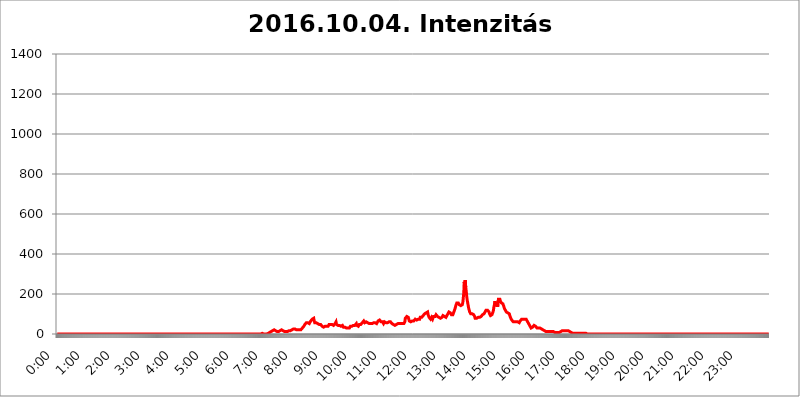
| Category | 2016.10.04. Intenzitás [W/m^2] |
|---|---|
| 0.0 | 0 |
| 0.0006944444444444445 | 0 |
| 0.001388888888888889 | 0 |
| 0.0020833333333333333 | 0 |
| 0.002777777777777778 | 0 |
| 0.003472222222222222 | 0 |
| 0.004166666666666667 | 0 |
| 0.004861111111111111 | 0 |
| 0.005555555555555556 | 0 |
| 0.0062499999999999995 | 0 |
| 0.006944444444444444 | 0 |
| 0.007638888888888889 | 0 |
| 0.008333333333333333 | 0 |
| 0.009027777777777779 | 0 |
| 0.009722222222222222 | 0 |
| 0.010416666666666666 | 0 |
| 0.011111111111111112 | 0 |
| 0.011805555555555555 | 0 |
| 0.012499999999999999 | 0 |
| 0.013194444444444444 | 0 |
| 0.013888888888888888 | 0 |
| 0.014583333333333332 | 0 |
| 0.015277777777777777 | 0 |
| 0.015972222222222224 | 0 |
| 0.016666666666666666 | 0 |
| 0.017361111111111112 | 0 |
| 0.018055555555555557 | 0 |
| 0.01875 | 0 |
| 0.019444444444444445 | 0 |
| 0.02013888888888889 | 0 |
| 0.020833333333333332 | 0 |
| 0.02152777777777778 | 0 |
| 0.022222222222222223 | 0 |
| 0.02291666666666667 | 0 |
| 0.02361111111111111 | 0 |
| 0.024305555555555556 | 0 |
| 0.024999999999999998 | 0 |
| 0.025694444444444447 | 0 |
| 0.02638888888888889 | 0 |
| 0.027083333333333334 | 0 |
| 0.027777777777777776 | 0 |
| 0.02847222222222222 | 0 |
| 0.029166666666666664 | 0 |
| 0.029861111111111113 | 0 |
| 0.030555555555555555 | 0 |
| 0.03125 | 0 |
| 0.03194444444444445 | 0 |
| 0.03263888888888889 | 0 |
| 0.03333333333333333 | 0 |
| 0.034027777777777775 | 0 |
| 0.034722222222222224 | 0 |
| 0.035416666666666666 | 0 |
| 0.036111111111111115 | 0 |
| 0.03680555555555556 | 0 |
| 0.0375 | 0 |
| 0.03819444444444444 | 0 |
| 0.03888888888888889 | 0 |
| 0.03958333333333333 | 0 |
| 0.04027777777777778 | 0 |
| 0.04097222222222222 | 0 |
| 0.041666666666666664 | 0 |
| 0.042361111111111106 | 0 |
| 0.04305555555555556 | 0 |
| 0.043750000000000004 | 0 |
| 0.044444444444444446 | 0 |
| 0.04513888888888889 | 0 |
| 0.04583333333333334 | 0 |
| 0.04652777777777778 | 0 |
| 0.04722222222222222 | 0 |
| 0.04791666666666666 | 0 |
| 0.04861111111111111 | 0 |
| 0.049305555555555554 | 0 |
| 0.049999999999999996 | 0 |
| 0.05069444444444445 | 0 |
| 0.051388888888888894 | 0 |
| 0.052083333333333336 | 0 |
| 0.05277777777777778 | 0 |
| 0.05347222222222222 | 0 |
| 0.05416666666666667 | 0 |
| 0.05486111111111111 | 0 |
| 0.05555555555555555 | 0 |
| 0.05625 | 0 |
| 0.05694444444444444 | 0 |
| 0.057638888888888885 | 0 |
| 0.05833333333333333 | 0 |
| 0.05902777777777778 | 0 |
| 0.059722222222222225 | 0 |
| 0.06041666666666667 | 0 |
| 0.061111111111111116 | 0 |
| 0.06180555555555556 | 0 |
| 0.0625 | 0 |
| 0.06319444444444444 | 0 |
| 0.06388888888888888 | 0 |
| 0.06458333333333334 | 0 |
| 0.06527777777777778 | 0 |
| 0.06597222222222222 | 0 |
| 0.06666666666666667 | 0 |
| 0.06736111111111111 | 0 |
| 0.06805555555555555 | 0 |
| 0.06874999999999999 | 0 |
| 0.06944444444444443 | 0 |
| 0.07013888888888889 | 0 |
| 0.07083333333333333 | 0 |
| 0.07152777777777779 | 0 |
| 0.07222222222222223 | 0 |
| 0.07291666666666667 | 0 |
| 0.07361111111111111 | 0 |
| 0.07430555555555556 | 0 |
| 0.075 | 0 |
| 0.07569444444444444 | 0 |
| 0.0763888888888889 | 0 |
| 0.07708333333333334 | 0 |
| 0.07777777777777778 | 0 |
| 0.07847222222222222 | 0 |
| 0.07916666666666666 | 0 |
| 0.0798611111111111 | 0 |
| 0.08055555555555556 | 0 |
| 0.08125 | 0 |
| 0.08194444444444444 | 0 |
| 0.08263888888888889 | 0 |
| 0.08333333333333333 | 0 |
| 0.08402777777777777 | 0 |
| 0.08472222222222221 | 0 |
| 0.08541666666666665 | 0 |
| 0.08611111111111112 | 0 |
| 0.08680555555555557 | 0 |
| 0.08750000000000001 | 0 |
| 0.08819444444444445 | 0 |
| 0.08888888888888889 | 0 |
| 0.08958333333333333 | 0 |
| 0.09027777777777778 | 0 |
| 0.09097222222222222 | 0 |
| 0.09166666666666667 | 0 |
| 0.09236111111111112 | 0 |
| 0.09305555555555556 | 0 |
| 0.09375 | 0 |
| 0.09444444444444444 | 0 |
| 0.09513888888888888 | 0 |
| 0.09583333333333333 | 0 |
| 0.09652777777777777 | 0 |
| 0.09722222222222222 | 0 |
| 0.09791666666666667 | 0 |
| 0.09861111111111111 | 0 |
| 0.09930555555555555 | 0 |
| 0.09999999999999999 | 0 |
| 0.10069444444444443 | 0 |
| 0.1013888888888889 | 0 |
| 0.10208333333333335 | 0 |
| 0.10277777777777779 | 0 |
| 0.10347222222222223 | 0 |
| 0.10416666666666667 | 0 |
| 0.10486111111111111 | 0 |
| 0.10555555555555556 | 0 |
| 0.10625 | 0 |
| 0.10694444444444444 | 0 |
| 0.1076388888888889 | 0 |
| 0.10833333333333334 | 0 |
| 0.10902777777777778 | 0 |
| 0.10972222222222222 | 0 |
| 0.1111111111111111 | 0 |
| 0.11180555555555556 | 0 |
| 0.11180555555555556 | 0 |
| 0.1125 | 0 |
| 0.11319444444444444 | 0 |
| 0.11388888888888889 | 0 |
| 0.11458333333333333 | 0 |
| 0.11527777777777777 | 0 |
| 0.11597222222222221 | 0 |
| 0.11666666666666665 | 0 |
| 0.1173611111111111 | 0 |
| 0.11805555555555557 | 0 |
| 0.11944444444444445 | 0 |
| 0.12013888888888889 | 0 |
| 0.12083333333333333 | 0 |
| 0.12152777777777778 | 0 |
| 0.12222222222222223 | 0 |
| 0.12291666666666667 | 0 |
| 0.12291666666666667 | 0 |
| 0.12361111111111112 | 0 |
| 0.12430555555555556 | 0 |
| 0.125 | 0 |
| 0.12569444444444444 | 0 |
| 0.12638888888888888 | 0 |
| 0.12708333333333333 | 0 |
| 0.16875 | 0 |
| 0.12847222222222224 | 0 |
| 0.12916666666666668 | 0 |
| 0.12986111111111112 | 0 |
| 0.13055555555555556 | 0 |
| 0.13125 | 0 |
| 0.13194444444444445 | 0 |
| 0.1326388888888889 | 0 |
| 0.13333333333333333 | 0 |
| 0.13402777777777777 | 0 |
| 0.13402777777777777 | 0 |
| 0.13472222222222222 | 0 |
| 0.13541666666666666 | 0 |
| 0.1361111111111111 | 0 |
| 0.13749999999999998 | 0 |
| 0.13819444444444443 | 0 |
| 0.1388888888888889 | 0 |
| 0.13958333333333334 | 0 |
| 0.14027777777777778 | 0 |
| 0.14097222222222222 | 0 |
| 0.14166666666666666 | 0 |
| 0.1423611111111111 | 0 |
| 0.14305555555555557 | 0 |
| 0.14375000000000002 | 0 |
| 0.14444444444444446 | 0 |
| 0.1451388888888889 | 0 |
| 0.1451388888888889 | 0 |
| 0.14652777777777778 | 0 |
| 0.14722222222222223 | 0 |
| 0.14791666666666667 | 0 |
| 0.1486111111111111 | 0 |
| 0.14930555555555555 | 0 |
| 0.15 | 0 |
| 0.15069444444444444 | 0 |
| 0.15138888888888888 | 0 |
| 0.15208333333333332 | 0 |
| 0.15277777777777776 | 0 |
| 0.15347222222222223 | 0 |
| 0.15416666666666667 | 0 |
| 0.15486111111111112 | 0 |
| 0.15555555555555556 | 0 |
| 0.15625 | 0 |
| 0.15694444444444444 | 0 |
| 0.15763888888888888 | 0 |
| 0.15833333333333333 | 0 |
| 0.15902777777777777 | 0 |
| 0.15972222222222224 | 0 |
| 0.16041666666666668 | 0 |
| 0.16111111111111112 | 0 |
| 0.16180555555555556 | 0 |
| 0.1625 | 0 |
| 0.16319444444444445 | 0 |
| 0.1638888888888889 | 0 |
| 0.16458333333333333 | 0 |
| 0.16527777777777777 | 0 |
| 0.16597222222222222 | 0 |
| 0.16666666666666666 | 0 |
| 0.1673611111111111 | 0 |
| 0.16805555555555554 | 0 |
| 0.16874999999999998 | 0 |
| 0.16944444444444443 | 0 |
| 0.17013888888888887 | 0 |
| 0.1708333333333333 | 0 |
| 0.17152777777777775 | 0 |
| 0.17222222222222225 | 0 |
| 0.1729166666666667 | 0 |
| 0.17361111111111113 | 0 |
| 0.17430555555555557 | 0 |
| 0.17500000000000002 | 0 |
| 0.17569444444444446 | 0 |
| 0.1763888888888889 | 0 |
| 0.17708333333333334 | 0 |
| 0.17777777777777778 | 0 |
| 0.17847222222222223 | 0 |
| 0.17916666666666667 | 0 |
| 0.1798611111111111 | 0 |
| 0.18055555555555555 | 0 |
| 0.18125 | 0 |
| 0.18194444444444444 | 0 |
| 0.1826388888888889 | 0 |
| 0.18333333333333335 | 0 |
| 0.1840277777777778 | 0 |
| 0.18472222222222223 | 0 |
| 0.18541666666666667 | 0 |
| 0.18611111111111112 | 0 |
| 0.18680555555555556 | 0 |
| 0.1875 | 0 |
| 0.18819444444444444 | 0 |
| 0.18888888888888888 | 0 |
| 0.18958333333333333 | 0 |
| 0.19027777777777777 | 0 |
| 0.1909722222222222 | 0 |
| 0.19166666666666665 | 0 |
| 0.19236111111111112 | 0 |
| 0.19305555555555554 | 0 |
| 0.19375 | 0 |
| 0.19444444444444445 | 0 |
| 0.1951388888888889 | 0 |
| 0.19583333333333333 | 0 |
| 0.19652777777777777 | 0 |
| 0.19722222222222222 | 0 |
| 0.19791666666666666 | 0 |
| 0.1986111111111111 | 0 |
| 0.19930555555555554 | 0 |
| 0.19999999999999998 | 0 |
| 0.20069444444444443 | 0 |
| 0.20138888888888887 | 0 |
| 0.2020833333333333 | 0 |
| 0.2027777777777778 | 0 |
| 0.2034722222222222 | 0 |
| 0.2041666666666667 | 0 |
| 0.20486111111111113 | 0 |
| 0.20555555555555557 | 0 |
| 0.20625000000000002 | 0 |
| 0.20694444444444446 | 0 |
| 0.2076388888888889 | 0 |
| 0.20833333333333334 | 0 |
| 0.20902777777777778 | 0 |
| 0.20972222222222223 | 0 |
| 0.21041666666666667 | 0 |
| 0.2111111111111111 | 0 |
| 0.21180555555555555 | 0 |
| 0.2125 | 0 |
| 0.21319444444444444 | 0 |
| 0.2138888888888889 | 0 |
| 0.21458333333333335 | 0 |
| 0.2152777777777778 | 0 |
| 0.21597222222222223 | 0 |
| 0.21666666666666667 | 0 |
| 0.21736111111111112 | 0 |
| 0.21805555555555556 | 0 |
| 0.21875 | 0 |
| 0.21944444444444444 | 0 |
| 0.22013888888888888 | 0 |
| 0.22083333333333333 | 0 |
| 0.22152777777777777 | 0 |
| 0.2222222222222222 | 0 |
| 0.22291666666666665 | 0 |
| 0.2236111111111111 | 0 |
| 0.22430555555555556 | 0 |
| 0.225 | 0 |
| 0.22569444444444445 | 0 |
| 0.2263888888888889 | 0 |
| 0.22708333333333333 | 0 |
| 0.22777777777777777 | 0 |
| 0.22847222222222222 | 0 |
| 0.22916666666666666 | 0 |
| 0.2298611111111111 | 0 |
| 0.23055555555555554 | 0 |
| 0.23124999999999998 | 0 |
| 0.23194444444444443 | 0 |
| 0.23263888888888887 | 0 |
| 0.2333333333333333 | 0 |
| 0.2340277777777778 | 0 |
| 0.2347222222222222 | 0 |
| 0.2354166666666667 | 0 |
| 0.23611111111111113 | 0 |
| 0.23680555555555557 | 0 |
| 0.23750000000000002 | 0 |
| 0.23819444444444446 | 0 |
| 0.2388888888888889 | 0 |
| 0.23958333333333334 | 0 |
| 0.24027777777777778 | 0 |
| 0.24097222222222223 | 0 |
| 0.24166666666666667 | 0 |
| 0.2423611111111111 | 0 |
| 0.24305555555555555 | 0 |
| 0.24375 | 0 |
| 0.24444444444444446 | 0 |
| 0.24513888888888888 | 0 |
| 0.24583333333333335 | 0 |
| 0.2465277777777778 | 0 |
| 0.24722222222222223 | 0 |
| 0.24791666666666667 | 0 |
| 0.24861111111111112 | 0 |
| 0.24930555555555556 | 0 |
| 0.25 | 0 |
| 0.25069444444444444 | 0 |
| 0.2513888888888889 | 0 |
| 0.2520833333333333 | 0 |
| 0.25277777777777777 | 0 |
| 0.2534722222222222 | 0 |
| 0.25416666666666665 | 0 |
| 0.2548611111111111 | 0 |
| 0.2555555555555556 | 0 |
| 0.25625000000000003 | 0 |
| 0.2569444444444445 | 0 |
| 0.2576388888888889 | 0 |
| 0.25833333333333336 | 0 |
| 0.2590277777777778 | 0 |
| 0.25972222222222224 | 0 |
| 0.2604166666666667 | 0 |
| 0.2611111111111111 | 0 |
| 0.26180555555555557 | 0 |
| 0.2625 | 0 |
| 0.26319444444444445 | 0 |
| 0.2638888888888889 | 0 |
| 0.26458333333333334 | 0 |
| 0.2652777777777778 | 0 |
| 0.2659722222222222 | 0 |
| 0.26666666666666666 | 0 |
| 0.2673611111111111 | 0 |
| 0.26805555555555555 | 0 |
| 0.26875 | 0 |
| 0.26944444444444443 | 0 |
| 0.2701388888888889 | 0 |
| 0.2708333333333333 | 0 |
| 0.27152777777777776 | 0 |
| 0.2722222222222222 | 0 |
| 0.27291666666666664 | 0 |
| 0.2736111111111111 | 0 |
| 0.2743055555555555 | 0 |
| 0.27499999999999997 | 0 |
| 0.27569444444444446 | 0 |
| 0.27638888888888885 | 0 |
| 0.27708333333333335 | 0 |
| 0.2777777777777778 | 0 |
| 0.27847222222222223 | 0 |
| 0.2791666666666667 | 0 |
| 0.2798611111111111 | 0 |
| 0.28055555555555556 | 0 |
| 0.28125 | 0 |
| 0.28194444444444444 | 0 |
| 0.2826388888888889 | 0 |
| 0.2833333333333333 | 0 |
| 0.28402777777777777 | 0 |
| 0.2847222222222222 | 0 |
| 0.28541666666666665 | 0 |
| 0.28611111111111115 | 0 |
| 0.28680555555555554 | 0 |
| 0.28750000000000003 | 3.525 |
| 0.2881944444444445 | 0 |
| 0.2888888888888889 | 3.525 |
| 0.28958333333333336 | 0 |
| 0.2902777777777778 | 3.525 |
| 0.29097222222222224 | 0 |
| 0.2916666666666667 | 0 |
| 0.2923611111111111 | 0 |
| 0.29305555555555557 | 0 |
| 0.29375 | 0 |
| 0.29444444444444445 | 0 |
| 0.2951388888888889 | 0 |
| 0.29583333333333334 | 3.525 |
| 0.2965277777777778 | 3.525 |
| 0.2972222222222222 | 3.525 |
| 0.29791666666666666 | 7.887 |
| 0.2986111111111111 | 7.887 |
| 0.29930555555555555 | 7.887 |
| 0.3 | 12.257 |
| 0.30069444444444443 | 12.257 |
| 0.3013888888888889 | 12.257 |
| 0.3020833333333333 | 16.636 |
| 0.30277777777777776 | 16.636 |
| 0.3034722222222222 | 21.024 |
| 0.30416666666666664 | 21.024 |
| 0.3048611111111111 | 21.024 |
| 0.3055555555555555 | 16.636 |
| 0.30624999999999997 | 16.636 |
| 0.3069444444444444 | 12.257 |
| 0.3076388888888889 | 12.257 |
| 0.30833333333333335 | 12.257 |
| 0.3090277777777778 | 16.636 |
| 0.30972222222222223 | 16.636 |
| 0.3104166666666667 | 12.257 |
| 0.3111111111111111 | 12.257 |
| 0.31180555555555556 | 12.257 |
| 0.3125 | 16.636 |
| 0.31319444444444444 | 16.636 |
| 0.3138888888888889 | 21.024 |
| 0.3145833333333333 | 21.024 |
| 0.31527777777777777 | 21.024 |
| 0.3159722222222222 | 21.024 |
| 0.31666666666666665 | 16.636 |
| 0.31736111111111115 | 12.257 |
| 0.31805555555555554 | 12.257 |
| 0.31875000000000003 | 12.257 |
| 0.3194444444444445 | 12.257 |
| 0.3201388888888889 | 12.257 |
| 0.32083333333333336 | 12.257 |
| 0.3215277777777778 | 12.257 |
| 0.32222222222222224 | 12.257 |
| 0.3229166666666667 | 12.257 |
| 0.3236111111111111 | 12.257 |
| 0.32430555555555557 | 12.257 |
| 0.325 | 16.636 |
| 0.32569444444444445 | 16.636 |
| 0.3263888888888889 | 21.024 |
| 0.32708333333333334 | 16.636 |
| 0.3277777777777778 | 21.024 |
| 0.3284722222222222 | 21.024 |
| 0.32916666666666666 | 21.024 |
| 0.3298611111111111 | 21.024 |
| 0.33055555555555555 | 25.419 |
| 0.33125 | 25.419 |
| 0.33194444444444443 | 21.024 |
| 0.3326388888888889 | 25.419 |
| 0.3333333333333333 | 25.419 |
| 0.3340277777777778 | 21.024 |
| 0.3347222222222222 | 21.024 |
| 0.3354166666666667 | 21.024 |
| 0.3361111111111111 | 16.636 |
| 0.3368055555555556 | 21.024 |
| 0.33749999999999997 | 21.024 |
| 0.33819444444444446 | 21.024 |
| 0.33888888888888885 | 21.024 |
| 0.33958333333333335 | 21.024 |
| 0.34027777777777773 | 21.024 |
| 0.34097222222222223 | 21.024 |
| 0.3416666666666666 | 21.024 |
| 0.3423611111111111 | 25.419 |
| 0.3430555555555555 | 25.419 |
| 0.34375 | 29.823 |
| 0.3444444444444445 | 29.823 |
| 0.3451388888888889 | 34.234 |
| 0.3458333333333334 | 38.653 |
| 0.34652777777777777 | 38.653 |
| 0.34722222222222227 | 47.511 |
| 0.34791666666666665 | 51.951 |
| 0.34861111111111115 | 51.951 |
| 0.34930555555555554 | 56.398 |
| 0.35000000000000003 | 60.85 |
| 0.3506944444444444 | 51.951 |
| 0.3513888888888889 | 56.398 |
| 0.3520833333333333 | 56.398 |
| 0.3527777777777778 | 56.398 |
| 0.3534722222222222 | 51.951 |
| 0.3541666666666667 | 47.511 |
| 0.3548611111111111 | 51.951 |
| 0.35555555555555557 | 65.31 |
| 0.35625 | 65.31 |
| 0.35694444444444445 | 69.775 |
| 0.3576388888888889 | 74.246 |
| 0.35833333333333334 | 74.246 |
| 0.3590277777777778 | 78.722 |
| 0.3597222222222222 | 78.722 |
| 0.36041666666666666 | 65.31 |
| 0.3611111111111111 | 56.398 |
| 0.36180555555555555 | 56.398 |
| 0.3625 | 56.398 |
| 0.36319444444444443 | 56.398 |
| 0.3638888888888889 | 60.85 |
| 0.3645833333333333 | 56.398 |
| 0.3652777777777778 | 51.951 |
| 0.3659722222222222 | 51.951 |
| 0.3666666666666667 | 47.511 |
| 0.3673611111111111 | 47.511 |
| 0.3680555555555556 | 47.511 |
| 0.36874999999999997 | 47.511 |
| 0.36944444444444446 | 47.511 |
| 0.37013888888888885 | 47.511 |
| 0.37083333333333335 | 43.079 |
| 0.37152777777777773 | 38.653 |
| 0.37222222222222223 | 38.653 |
| 0.3729166666666666 | 34.234 |
| 0.3736111111111111 | 34.234 |
| 0.3743055555555555 | 34.234 |
| 0.375 | 34.234 |
| 0.3756944444444445 | 38.653 |
| 0.3763888888888889 | 43.079 |
| 0.3770833333333334 | 43.079 |
| 0.37777777777777777 | 38.653 |
| 0.37847222222222227 | 38.653 |
| 0.37916666666666665 | 38.653 |
| 0.37986111111111115 | 38.653 |
| 0.38055555555555554 | 38.653 |
| 0.38125000000000003 | 47.511 |
| 0.3819444444444444 | 47.511 |
| 0.3826388888888889 | 51.951 |
| 0.3833333333333333 | 47.511 |
| 0.3840277777777778 | 43.079 |
| 0.3847222222222222 | 47.511 |
| 0.3854166666666667 | 47.511 |
| 0.3861111111111111 | 43.079 |
| 0.38680555555555557 | 43.079 |
| 0.3875 | 43.079 |
| 0.38819444444444445 | 43.079 |
| 0.3888888888888889 | 47.511 |
| 0.38958333333333334 | 51.951 |
| 0.3902777777777778 | 56.398 |
| 0.3909722222222222 | 60.85 |
| 0.39166666666666666 | 47.511 |
| 0.3923611111111111 | 47.511 |
| 0.39305555555555555 | 43.079 |
| 0.39375 | 43.079 |
| 0.39444444444444443 | 38.653 |
| 0.3951388888888889 | 38.653 |
| 0.3958333333333333 | 43.079 |
| 0.3965277777777778 | 43.079 |
| 0.3972222222222222 | 43.079 |
| 0.3979166666666667 | 38.653 |
| 0.3986111111111111 | 43.079 |
| 0.3993055555555556 | 43.079 |
| 0.39999999999999997 | 43.079 |
| 0.40069444444444446 | 38.653 |
| 0.40138888888888885 | 34.234 |
| 0.40208333333333335 | 38.653 |
| 0.40277777777777773 | 38.653 |
| 0.40347222222222223 | 34.234 |
| 0.4041666666666666 | 34.234 |
| 0.4048611111111111 | 29.823 |
| 0.4055555555555555 | 29.823 |
| 0.40625 | 29.823 |
| 0.4069444444444445 | 29.823 |
| 0.4076388888888889 | 29.823 |
| 0.4083333333333334 | 34.234 |
| 0.40902777777777777 | 34.234 |
| 0.40972222222222227 | 29.823 |
| 0.41041666666666665 | 34.234 |
| 0.41111111111111115 | 38.653 |
| 0.41180555555555554 | 34.234 |
| 0.41250000000000003 | 38.653 |
| 0.4131944444444444 | 38.653 |
| 0.4138888888888889 | 38.653 |
| 0.4145833333333333 | 38.653 |
| 0.4152777777777778 | 43.079 |
| 0.4159722222222222 | 43.079 |
| 0.4166666666666667 | 43.079 |
| 0.4173611111111111 | 43.079 |
| 0.41805555555555557 | 47.511 |
| 0.41875 | 47.511 |
| 0.41944444444444445 | 51.951 |
| 0.4201388888888889 | 43.079 |
| 0.42083333333333334 | 43.079 |
| 0.4215277777777778 | 47.511 |
| 0.4222222222222222 | 38.653 |
| 0.42291666666666666 | 43.079 |
| 0.4236111111111111 | 47.511 |
| 0.42430555555555555 | 43.079 |
| 0.425 | 47.511 |
| 0.42569444444444443 | 47.511 |
| 0.4263888888888889 | 51.951 |
| 0.4270833333333333 | 51.951 |
| 0.4277777777777778 | 56.398 |
| 0.4284722222222222 | 56.398 |
| 0.4291666666666667 | 60.85 |
| 0.4298611111111111 | 65.31 |
| 0.4305555555555556 | 60.85 |
| 0.43124999999999997 | 56.398 |
| 0.43194444444444446 | 56.398 |
| 0.43263888888888885 | 60.85 |
| 0.43333333333333335 | 60.85 |
| 0.43402777777777773 | 56.398 |
| 0.43472222222222223 | 56.398 |
| 0.4354166666666666 | 56.398 |
| 0.4361111111111111 | 56.398 |
| 0.4368055555555555 | 56.398 |
| 0.4375 | 51.951 |
| 0.4381944444444445 | 51.951 |
| 0.4388888888888889 | 51.951 |
| 0.4395833333333334 | 51.951 |
| 0.44027777777777777 | 47.511 |
| 0.44097222222222227 | 47.511 |
| 0.44166666666666665 | 51.951 |
| 0.44236111111111115 | 51.951 |
| 0.44305555555555554 | 51.951 |
| 0.44375000000000003 | 56.398 |
| 0.4444444444444444 | 51.951 |
| 0.4451388888888889 | 51.951 |
| 0.4458333333333333 | 56.398 |
| 0.4465277777777778 | 56.398 |
| 0.4472222222222222 | 51.951 |
| 0.4479166666666667 | 51.951 |
| 0.4486111111111111 | 51.951 |
| 0.44930555555555557 | 56.398 |
| 0.45 | 65.31 |
| 0.45069444444444445 | 69.775 |
| 0.4513888888888889 | 69.775 |
| 0.45208333333333334 | 69.775 |
| 0.4527777777777778 | 74.246 |
| 0.4534722222222222 | 74.246 |
| 0.45416666666666666 | 60.85 |
| 0.4548611111111111 | 56.398 |
| 0.45555555555555555 | 60.85 |
| 0.45625 | 60.85 |
| 0.45694444444444443 | 56.398 |
| 0.4576388888888889 | 51.951 |
| 0.4583333333333333 | 56.398 |
| 0.4590277777777778 | 60.85 |
| 0.4597222222222222 | 65.31 |
| 0.4604166666666667 | 60.85 |
| 0.4611111111111111 | 56.398 |
| 0.4618055555555556 | 56.398 |
| 0.46249999999999997 | 56.398 |
| 0.46319444444444446 | 56.398 |
| 0.46388888888888885 | 51.951 |
| 0.46458333333333335 | 56.398 |
| 0.46527777777777773 | 60.85 |
| 0.46597222222222223 | 65.31 |
| 0.4666666666666666 | 65.31 |
| 0.4673611111111111 | 60.85 |
| 0.4680555555555555 | 60.85 |
| 0.46875 | 56.398 |
| 0.4694444444444445 | 51.951 |
| 0.4701388888888889 | 51.951 |
| 0.4708333333333334 | 51.951 |
| 0.47152777777777777 | 47.511 |
| 0.47222222222222227 | 43.079 |
| 0.47291666666666665 | 43.079 |
| 0.47361111111111115 | 43.079 |
| 0.47430555555555554 | 43.079 |
| 0.47500000000000003 | 43.079 |
| 0.4756944444444444 | 47.511 |
| 0.4763888888888889 | 47.511 |
| 0.4770833333333333 | 47.511 |
| 0.4777777777777778 | 51.951 |
| 0.4784722222222222 | 51.951 |
| 0.4791666666666667 | 51.951 |
| 0.4798611111111111 | 51.951 |
| 0.48055555555555557 | 51.951 |
| 0.48125 | 47.511 |
| 0.48194444444444445 | 51.951 |
| 0.4826388888888889 | 51.951 |
| 0.48333333333333334 | 47.511 |
| 0.4840277777777778 | 51.951 |
| 0.4847222222222222 | 51.951 |
| 0.48541666666666666 | 51.951 |
| 0.4861111111111111 | 51.951 |
| 0.48680555555555555 | 56.398 |
| 0.4875 | 60.85 |
| 0.48819444444444443 | 78.722 |
| 0.4888888888888889 | 83.205 |
| 0.4895833333333333 | 83.205 |
| 0.4902777777777778 | 87.692 |
| 0.4909722222222222 | 92.184 |
| 0.4916666666666667 | 92.184 |
| 0.4923611111111111 | 83.205 |
| 0.4930555555555556 | 74.246 |
| 0.49374999999999997 | 65.31 |
| 0.49444444444444446 | 65.31 |
| 0.49513888888888885 | 60.85 |
| 0.49583333333333335 | 60.85 |
| 0.49652777777777773 | 65.31 |
| 0.49722222222222223 | 65.31 |
| 0.4979166666666666 | 65.31 |
| 0.4986111111111111 | 60.85 |
| 0.4993055555555555 | 60.85 |
| 0.5 | 65.31 |
| 0.5006944444444444 | 65.31 |
| 0.5013888888888889 | 65.31 |
| 0.5020833333333333 | 74.246 |
| 0.5027777777777778 | 69.775 |
| 0.5034722222222222 | 69.775 |
| 0.5041666666666667 | 69.775 |
| 0.5048611111111111 | 65.31 |
| 0.5055555555555555 | 74.246 |
| 0.50625 | 74.246 |
| 0.5069444444444444 | 69.775 |
| 0.5076388888888889 | 69.775 |
| 0.5083333333333333 | 74.246 |
| 0.5090277777777777 | 83.205 |
| 0.5097222222222222 | 83.205 |
| 0.5104166666666666 | 83.205 |
| 0.5111111111111112 | 83.205 |
| 0.5118055555555555 | 87.692 |
| 0.5125000000000001 | 87.692 |
| 0.5131944444444444 | 92.184 |
| 0.513888888888889 | 92.184 |
| 0.5145833333333333 | 96.682 |
| 0.5152777777777778 | 101.184 |
| 0.5159722222222222 | 101.184 |
| 0.5166666666666667 | 105.69 |
| 0.517361111111111 | 105.69 |
| 0.5180555555555556 | 105.69 |
| 0.5187499999999999 | 101.184 |
| 0.5194444444444445 | 110.201 |
| 0.5201388888888888 | 96.682 |
| 0.5208333333333334 | 92.184 |
| 0.5215277777777778 | 83.205 |
| 0.5222222222222223 | 78.722 |
| 0.5229166666666667 | 78.722 |
| 0.5236111111111111 | 74.246 |
| 0.5243055555555556 | 78.722 |
| 0.525 | 83.205 |
| 0.5256944444444445 | 78.722 |
| 0.5263888888888889 | 74.246 |
| 0.5270833333333333 | 74.246 |
| 0.5277777777777778 | 87.692 |
| 0.5284722222222222 | 92.184 |
| 0.5291666666666667 | 87.692 |
| 0.5298611111111111 | 87.692 |
| 0.5305555555555556 | 92.184 |
| 0.53125 | 96.682 |
| 0.5319444444444444 | 96.682 |
| 0.5326388888888889 | 92.184 |
| 0.5333333333333333 | 87.692 |
| 0.5340277777777778 | 87.692 |
| 0.5347222222222222 | 83.205 |
| 0.5354166666666667 | 83.205 |
| 0.5361111111111111 | 78.722 |
| 0.5368055555555555 | 78.722 |
| 0.5375 | 78.722 |
| 0.5381944444444444 | 78.722 |
| 0.5388888888888889 | 83.205 |
| 0.5395833333333333 | 83.205 |
| 0.5402777777777777 | 87.692 |
| 0.5409722222222222 | 92.184 |
| 0.5416666666666666 | 92.184 |
| 0.5423611111111112 | 92.184 |
| 0.5430555555555555 | 87.692 |
| 0.5437500000000001 | 83.205 |
| 0.5444444444444444 | 83.205 |
| 0.545138888888889 | 83.205 |
| 0.5458333333333333 | 87.692 |
| 0.5465277777777778 | 92.184 |
| 0.5472222222222222 | 96.682 |
| 0.5479166666666667 | 101.184 |
| 0.548611111111111 | 105.69 |
| 0.5493055555555556 | 110.201 |
| 0.5499999999999999 | 110.201 |
| 0.5506944444444445 | 110.201 |
| 0.5513888888888888 | 105.69 |
| 0.5520833333333334 | 101.184 |
| 0.5527777777777778 | 96.682 |
| 0.5534722222222223 | 92.184 |
| 0.5541666666666667 | 92.184 |
| 0.5548611111111111 | 96.682 |
| 0.5555555555555556 | 101.184 |
| 0.55625 | 110.201 |
| 0.5569444444444445 | 114.716 |
| 0.5576388888888889 | 123.758 |
| 0.5583333333333333 | 132.814 |
| 0.5590277777777778 | 141.884 |
| 0.5597222222222222 | 146.423 |
| 0.5604166666666667 | 155.509 |
| 0.5611111111111111 | 160.056 |
| 0.5618055555555556 | 160.056 |
| 0.5625 | 155.509 |
| 0.5631944444444444 | 150.964 |
| 0.5638888888888889 | 146.423 |
| 0.5645833333333333 | 146.423 |
| 0.5652777777777778 | 141.884 |
| 0.5659722222222222 | 141.884 |
| 0.5666666666666667 | 137.347 |
| 0.5673611111111111 | 141.884 |
| 0.5680555555555555 | 146.423 |
| 0.56875 | 155.509 |
| 0.5694444444444444 | 178.264 |
| 0.5701388888888889 | 205.62 |
| 0.5708333333333333 | 260.373 |
| 0.5715277777777777 | 237.564 |
| 0.5722222222222222 | 269.49 |
| 0.5729166666666666 | 233 |
| 0.5736111111111112 | 214.746 |
| 0.5743055555555555 | 187.378 |
| 0.5750000000000001 | 169.156 |
| 0.5756944444444444 | 155.509 |
| 0.576388888888889 | 141.884 |
| 0.5770833333333333 | 128.284 |
| 0.5777777777777778 | 119.235 |
| 0.5784722222222222 | 110.201 |
| 0.5791666666666667 | 105.69 |
| 0.579861111111111 | 101.184 |
| 0.5805555555555556 | 101.184 |
| 0.5812499999999999 | 101.184 |
| 0.5819444444444445 | 101.184 |
| 0.5826388888888888 | 105.69 |
| 0.5833333333333334 | 101.184 |
| 0.5840277777777778 | 96.682 |
| 0.5847222222222223 | 92.184 |
| 0.5854166666666667 | 87.692 |
| 0.5861111111111111 | 78.722 |
| 0.5868055555555556 | 74.246 |
| 0.5875 | 74.246 |
| 0.5881944444444445 | 78.722 |
| 0.5888888888888889 | 78.722 |
| 0.5895833333333333 | 83.205 |
| 0.5902777777777778 | 83.205 |
| 0.5909722222222222 | 83.205 |
| 0.5916666666666667 | 83.205 |
| 0.5923611111111111 | 83.205 |
| 0.5930555555555556 | 83.205 |
| 0.59375 | 83.205 |
| 0.5944444444444444 | 87.692 |
| 0.5951388888888889 | 92.184 |
| 0.5958333333333333 | 92.184 |
| 0.5965277777777778 | 96.682 |
| 0.5972222222222222 | 96.682 |
| 0.5979166666666667 | 101.184 |
| 0.5986111111111111 | 101.184 |
| 0.5993055555555555 | 105.69 |
| 0.6 | 110.201 |
| 0.6006944444444444 | 110.201 |
| 0.6013888888888889 | 119.235 |
| 0.6020833333333333 | 119.235 |
| 0.6027777777777777 | 119.235 |
| 0.6034722222222222 | 119.235 |
| 0.6041666666666666 | 119.235 |
| 0.6048611111111112 | 114.716 |
| 0.6055555555555555 | 110.201 |
| 0.6062500000000001 | 101.184 |
| 0.6069444444444444 | 101.184 |
| 0.607638888888889 | 92.184 |
| 0.6083333333333333 | 92.184 |
| 0.6090277777777778 | 92.184 |
| 0.6097222222222222 | 96.682 |
| 0.6104166666666667 | 101.184 |
| 0.611111111111111 | 110.201 |
| 0.6118055555555556 | 119.235 |
| 0.6124999999999999 | 137.347 |
| 0.6131944444444445 | 146.423 |
| 0.6138888888888888 | 164.605 |
| 0.6145833333333334 | 150.964 |
| 0.6152777777777778 | 146.423 |
| 0.6159722222222223 | 141.884 |
| 0.6166666666666667 | 137.347 |
| 0.6173611111111111 | 137.347 |
| 0.6180555555555556 | 141.884 |
| 0.61875 | 173.709 |
| 0.6194444444444445 | 173.709 |
| 0.6201388888888889 | 173.709 |
| 0.6208333333333333 | 173.709 |
| 0.6215277777777778 | 164.605 |
| 0.6222222222222222 | 160.056 |
| 0.6229166666666667 | 155.509 |
| 0.6236111111111111 | 155.509 |
| 0.6243055555555556 | 155.509 |
| 0.625 | 150.964 |
| 0.6256944444444444 | 146.423 |
| 0.6263888888888889 | 137.347 |
| 0.6270833333333333 | 128.284 |
| 0.6277777777777778 | 123.758 |
| 0.6284722222222222 | 119.235 |
| 0.6291666666666667 | 114.716 |
| 0.6298611111111111 | 110.201 |
| 0.6305555555555555 | 105.69 |
| 0.63125 | 105.69 |
| 0.6319444444444444 | 105.69 |
| 0.6326388888888889 | 105.69 |
| 0.6333333333333333 | 105.69 |
| 0.6340277777777777 | 101.184 |
| 0.6347222222222222 | 92.184 |
| 0.6354166666666666 | 87.692 |
| 0.6361111111111112 | 78.722 |
| 0.6368055555555555 | 74.246 |
| 0.6375000000000001 | 69.775 |
| 0.6381944444444444 | 65.31 |
| 0.638888888888889 | 65.31 |
| 0.6395833333333333 | 60.85 |
| 0.6402777777777778 | 60.85 |
| 0.6409722222222222 | 60.85 |
| 0.6416666666666667 | 60.85 |
| 0.642361111111111 | 56.398 |
| 0.6430555555555556 | 60.85 |
| 0.6437499999999999 | 60.85 |
| 0.6444444444444445 | 60.85 |
| 0.6451388888888888 | 60.85 |
| 0.6458333333333334 | 60.85 |
| 0.6465277777777778 | 56.398 |
| 0.6472222222222223 | 56.398 |
| 0.6479166666666667 | 56.398 |
| 0.6486111111111111 | 60.85 |
| 0.6493055555555556 | 65.31 |
| 0.65 | 65.31 |
| 0.6506944444444445 | 69.775 |
| 0.6513888888888889 | 74.246 |
| 0.6520833333333333 | 74.246 |
| 0.6527777777777778 | 74.246 |
| 0.6534722222222222 | 74.246 |
| 0.6541666666666667 | 74.246 |
| 0.6548611111111111 | 74.246 |
| 0.6555555555555556 | 74.246 |
| 0.65625 | 74.246 |
| 0.6569444444444444 | 74.246 |
| 0.6576388888888889 | 74.246 |
| 0.6583333333333333 | 69.775 |
| 0.6590277777777778 | 65.31 |
| 0.6597222222222222 | 60.85 |
| 0.6604166666666667 | 56.398 |
| 0.6611111111111111 | 51.951 |
| 0.6618055555555555 | 47.511 |
| 0.6625 | 43.079 |
| 0.6631944444444444 | 38.653 |
| 0.6638888888888889 | 34.234 |
| 0.6645833333333333 | 29.823 |
| 0.6652777777777777 | 29.823 |
| 0.6659722222222222 | 29.823 |
| 0.6666666666666666 | 34.234 |
| 0.6673611111111111 | 38.653 |
| 0.6680555555555556 | 38.653 |
| 0.6687500000000001 | 43.079 |
| 0.6694444444444444 | 38.653 |
| 0.6701388888888888 | 38.653 |
| 0.6708333333333334 | 38.653 |
| 0.6715277777777778 | 38.653 |
| 0.6722222222222222 | 34.234 |
| 0.6729166666666666 | 29.823 |
| 0.6736111111111112 | 29.823 |
| 0.6743055555555556 | 29.823 |
| 0.6749999999999999 | 29.823 |
| 0.6756944444444444 | 29.823 |
| 0.6763888888888889 | 29.823 |
| 0.6770833333333334 | 29.823 |
| 0.6777777777777777 | 29.823 |
| 0.6784722222222223 | 25.419 |
| 0.6791666666666667 | 25.419 |
| 0.6798611111111111 | 25.419 |
| 0.6805555555555555 | 25.419 |
| 0.68125 | 21.024 |
| 0.6819444444444445 | 21.024 |
| 0.6826388888888889 | 16.636 |
| 0.6833333333333332 | 16.636 |
| 0.6840277777777778 | 16.636 |
| 0.6847222222222222 | 12.257 |
| 0.6854166666666667 | 12.257 |
| 0.686111111111111 | 12.257 |
| 0.6868055555555556 | 12.257 |
| 0.6875 | 12.257 |
| 0.6881944444444444 | 12.257 |
| 0.688888888888889 | 12.257 |
| 0.6895833333333333 | 12.257 |
| 0.6902777777777778 | 12.257 |
| 0.6909722222222222 | 12.257 |
| 0.6916666666666668 | 12.257 |
| 0.6923611111111111 | 12.257 |
| 0.6930555555555555 | 12.257 |
| 0.69375 | 12.257 |
| 0.6944444444444445 | 12.257 |
| 0.6951388888888889 | 12.257 |
| 0.6958333333333333 | 12.257 |
| 0.6965277777777777 | 12.257 |
| 0.6972222222222223 | 12.257 |
| 0.6979166666666666 | 7.887 |
| 0.6986111111111111 | 7.887 |
| 0.6993055555555556 | 7.887 |
| 0.7000000000000001 | 7.887 |
| 0.7006944444444444 | 7.887 |
| 0.7013888888888888 | 7.887 |
| 0.7020833333333334 | 7.887 |
| 0.7027777777777778 | 7.887 |
| 0.7034722222222222 | 7.887 |
| 0.7041666666666666 | 7.887 |
| 0.7048611111111112 | 7.887 |
| 0.7055555555555556 | 7.887 |
| 0.7062499999999999 | 12.257 |
| 0.7069444444444444 | 12.257 |
| 0.7076388888888889 | 12.257 |
| 0.7083333333333334 | 16.636 |
| 0.7090277777777777 | 16.636 |
| 0.7097222222222223 | 16.636 |
| 0.7104166666666667 | 16.636 |
| 0.7111111111111111 | 16.636 |
| 0.7118055555555555 | 16.636 |
| 0.7125 | 16.636 |
| 0.7131944444444445 | 16.636 |
| 0.7138888888888889 | 16.636 |
| 0.7145833333333332 | 16.636 |
| 0.7152777777777778 | 16.636 |
| 0.7159722222222222 | 16.636 |
| 0.7166666666666667 | 16.636 |
| 0.717361111111111 | 16.636 |
| 0.7180555555555556 | 16.636 |
| 0.71875 | 12.257 |
| 0.7194444444444444 | 7.887 |
| 0.720138888888889 | 7.887 |
| 0.7208333333333333 | 7.887 |
| 0.7215277777777778 | 7.887 |
| 0.7222222222222222 | 3.525 |
| 0.7229166666666668 | 3.525 |
| 0.7236111111111111 | 3.525 |
| 0.7243055555555555 | 3.525 |
| 0.725 | 3.525 |
| 0.7256944444444445 | 3.525 |
| 0.7263888888888889 | 3.525 |
| 0.7270833333333333 | 3.525 |
| 0.7277777777777777 | 3.525 |
| 0.7284722222222223 | 3.525 |
| 0.7291666666666666 | 3.525 |
| 0.7298611111111111 | 3.525 |
| 0.7305555555555556 | 3.525 |
| 0.7312500000000001 | 3.525 |
| 0.7319444444444444 | 3.525 |
| 0.7326388888888888 | 3.525 |
| 0.7333333333333334 | 3.525 |
| 0.7340277777777778 | 3.525 |
| 0.7347222222222222 | 3.525 |
| 0.7354166666666666 | 3.525 |
| 0.7361111111111112 | 3.525 |
| 0.7368055555555556 | 3.525 |
| 0.7374999999999999 | 3.525 |
| 0.7381944444444444 | 3.525 |
| 0.7388888888888889 | 3.525 |
| 0.7395833333333334 | 3.525 |
| 0.7402777777777777 | 3.525 |
| 0.7409722222222223 | 3.525 |
| 0.7416666666666667 | 3.525 |
| 0.7423611111111111 | 3.525 |
| 0.7430555555555555 | 3.525 |
| 0.74375 | 0 |
| 0.7444444444444445 | 3.525 |
| 0.7451388888888889 | 0 |
| 0.7458333333333332 | 0 |
| 0.7465277777777778 | 0 |
| 0.7472222222222222 | 0 |
| 0.7479166666666667 | 0 |
| 0.748611111111111 | 0 |
| 0.7493055555555556 | 0 |
| 0.75 | 0 |
| 0.7506944444444444 | 0 |
| 0.751388888888889 | 0 |
| 0.7520833333333333 | 0 |
| 0.7527777777777778 | 0 |
| 0.7534722222222222 | 0 |
| 0.7541666666666668 | 0 |
| 0.7548611111111111 | 0 |
| 0.7555555555555555 | 0 |
| 0.75625 | 0 |
| 0.7569444444444445 | 0 |
| 0.7576388888888889 | 0 |
| 0.7583333333333333 | 0 |
| 0.7590277777777777 | 0 |
| 0.7597222222222223 | 0 |
| 0.7604166666666666 | 0 |
| 0.7611111111111111 | 0 |
| 0.7618055555555556 | 0 |
| 0.7625000000000001 | 0 |
| 0.7631944444444444 | 0 |
| 0.7638888888888888 | 0 |
| 0.7645833333333334 | 0 |
| 0.7652777777777778 | 0 |
| 0.7659722222222222 | 0 |
| 0.7666666666666666 | 0 |
| 0.7673611111111112 | 0 |
| 0.7680555555555556 | 0 |
| 0.7687499999999999 | 0 |
| 0.7694444444444444 | 0 |
| 0.7701388888888889 | 0 |
| 0.7708333333333334 | 0 |
| 0.7715277777777777 | 0 |
| 0.7722222222222223 | 0 |
| 0.7729166666666667 | 0 |
| 0.7736111111111111 | 0 |
| 0.7743055555555555 | 0 |
| 0.775 | 0 |
| 0.7756944444444445 | 0 |
| 0.7763888888888889 | 0 |
| 0.7770833333333332 | 0 |
| 0.7777777777777778 | 0 |
| 0.7784722222222222 | 0 |
| 0.7791666666666667 | 0 |
| 0.779861111111111 | 0 |
| 0.7805555555555556 | 0 |
| 0.78125 | 0 |
| 0.7819444444444444 | 0 |
| 0.782638888888889 | 0 |
| 0.7833333333333333 | 0 |
| 0.7840277777777778 | 0 |
| 0.7847222222222222 | 0 |
| 0.7854166666666668 | 0 |
| 0.7861111111111111 | 0 |
| 0.7868055555555555 | 0 |
| 0.7875 | 0 |
| 0.7881944444444445 | 0 |
| 0.7888888888888889 | 0 |
| 0.7895833333333333 | 0 |
| 0.7902777777777777 | 0 |
| 0.7909722222222223 | 0 |
| 0.7916666666666666 | 0 |
| 0.7923611111111111 | 0 |
| 0.7930555555555556 | 0 |
| 0.7937500000000001 | 0 |
| 0.7944444444444444 | 0 |
| 0.7951388888888888 | 0 |
| 0.7958333333333334 | 0 |
| 0.7965277777777778 | 0 |
| 0.7972222222222222 | 0 |
| 0.7979166666666666 | 0 |
| 0.7986111111111112 | 0 |
| 0.7993055555555556 | 0 |
| 0.7999999999999999 | 0 |
| 0.8006944444444444 | 0 |
| 0.8013888888888889 | 0 |
| 0.8020833333333334 | 0 |
| 0.8027777777777777 | 0 |
| 0.8034722222222223 | 0 |
| 0.8041666666666667 | 0 |
| 0.8048611111111111 | 0 |
| 0.8055555555555555 | 0 |
| 0.80625 | 0 |
| 0.8069444444444445 | 0 |
| 0.8076388888888889 | 0 |
| 0.8083333333333332 | 0 |
| 0.8090277777777778 | 0 |
| 0.8097222222222222 | 0 |
| 0.8104166666666667 | 0 |
| 0.811111111111111 | 0 |
| 0.8118055555555556 | 0 |
| 0.8125 | 0 |
| 0.8131944444444444 | 0 |
| 0.813888888888889 | 0 |
| 0.8145833333333333 | 0 |
| 0.8152777777777778 | 0 |
| 0.8159722222222222 | 0 |
| 0.8166666666666668 | 0 |
| 0.8173611111111111 | 0 |
| 0.8180555555555555 | 0 |
| 0.81875 | 0 |
| 0.8194444444444445 | 0 |
| 0.8201388888888889 | 0 |
| 0.8208333333333333 | 0 |
| 0.8215277777777777 | 0 |
| 0.8222222222222223 | 0 |
| 0.8229166666666666 | 0 |
| 0.8236111111111111 | 0 |
| 0.8243055555555556 | 0 |
| 0.8250000000000001 | 0 |
| 0.8256944444444444 | 0 |
| 0.8263888888888888 | 0 |
| 0.8270833333333334 | 0 |
| 0.8277777777777778 | 0 |
| 0.8284722222222222 | 0 |
| 0.8291666666666666 | 0 |
| 0.8298611111111112 | 0 |
| 0.8305555555555556 | 0 |
| 0.8312499999999999 | 0 |
| 0.8319444444444444 | 0 |
| 0.8326388888888889 | 0 |
| 0.8333333333333334 | 0 |
| 0.8340277777777777 | 0 |
| 0.8347222222222223 | 0 |
| 0.8354166666666667 | 0 |
| 0.8361111111111111 | 0 |
| 0.8368055555555555 | 0 |
| 0.8375 | 0 |
| 0.8381944444444445 | 0 |
| 0.8388888888888889 | 0 |
| 0.8395833333333332 | 0 |
| 0.8402777777777778 | 0 |
| 0.8409722222222222 | 0 |
| 0.8416666666666667 | 0 |
| 0.842361111111111 | 0 |
| 0.8430555555555556 | 0 |
| 0.84375 | 0 |
| 0.8444444444444444 | 0 |
| 0.845138888888889 | 0 |
| 0.8458333333333333 | 0 |
| 0.8465277777777778 | 0 |
| 0.8472222222222222 | 0 |
| 0.8479166666666668 | 0 |
| 0.8486111111111111 | 0 |
| 0.8493055555555555 | 0 |
| 0.85 | 0 |
| 0.8506944444444445 | 0 |
| 0.8513888888888889 | 0 |
| 0.8520833333333333 | 0 |
| 0.8527777777777777 | 0 |
| 0.8534722222222223 | 0 |
| 0.8541666666666666 | 0 |
| 0.8548611111111111 | 0 |
| 0.8555555555555556 | 0 |
| 0.8562500000000001 | 0 |
| 0.8569444444444444 | 0 |
| 0.8576388888888888 | 0 |
| 0.8583333333333334 | 0 |
| 0.8590277777777778 | 0 |
| 0.8597222222222222 | 0 |
| 0.8604166666666666 | 0 |
| 0.8611111111111112 | 0 |
| 0.8618055555555556 | 0 |
| 0.8624999999999999 | 0 |
| 0.8631944444444444 | 0 |
| 0.8638888888888889 | 0 |
| 0.8645833333333334 | 0 |
| 0.8652777777777777 | 0 |
| 0.8659722222222223 | 0 |
| 0.8666666666666667 | 0 |
| 0.8673611111111111 | 0 |
| 0.8680555555555555 | 0 |
| 0.86875 | 0 |
| 0.8694444444444445 | 0 |
| 0.8701388888888889 | 0 |
| 0.8708333333333332 | 0 |
| 0.8715277777777778 | 0 |
| 0.8722222222222222 | 0 |
| 0.8729166666666667 | 0 |
| 0.873611111111111 | 0 |
| 0.8743055555555556 | 0 |
| 0.875 | 0 |
| 0.8756944444444444 | 0 |
| 0.876388888888889 | 0 |
| 0.8770833333333333 | 0 |
| 0.8777777777777778 | 0 |
| 0.8784722222222222 | 0 |
| 0.8791666666666668 | 0 |
| 0.8798611111111111 | 0 |
| 0.8805555555555555 | 0 |
| 0.88125 | 0 |
| 0.8819444444444445 | 0 |
| 0.8826388888888889 | 0 |
| 0.8833333333333333 | 0 |
| 0.8840277777777777 | 0 |
| 0.8847222222222223 | 0 |
| 0.8854166666666666 | 0 |
| 0.8861111111111111 | 0 |
| 0.8868055555555556 | 0 |
| 0.8875000000000001 | 0 |
| 0.8881944444444444 | 0 |
| 0.8888888888888888 | 0 |
| 0.8895833333333334 | 0 |
| 0.8902777777777778 | 0 |
| 0.8909722222222222 | 0 |
| 0.8916666666666666 | 0 |
| 0.8923611111111112 | 0 |
| 0.8930555555555556 | 0 |
| 0.8937499999999999 | 0 |
| 0.8944444444444444 | 0 |
| 0.8951388888888889 | 0 |
| 0.8958333333333334 | 0 |
| 0.8965277777777777 | 0 |
| 0.8972222222222223 | 0 |
| 0.8979166666666667 | 0 |
| 0.8986111111111111 | 0 |
| 0.8993055555555555 | 0 |
| 0.9 | 0 |
| 0.9006944444444445 | 0 |
| 0.9013888888888889 | 0 |
| 0.9020833333333332 | 0 |
| 0.9027777777777778 | 0 |
| 0.9034722222222222 | 0 |
| 0.9041666666666667 | 0 |
| 0.904861111111111 | 0 |
| 0.9055555555555556 | 0 |
| 0.90625 | 0 |
| 0.9069444444444444 | 0 |
| 0.907638888888889 | 0 |
| 0.9083333333333333 | 0 |
| 0.9090277777777778 | 0 |
| 0.9097222222222222 | 0 |
| 0.9104166666666668 | 0 |
| 0.9111111111111111 | 0 |
| 0.9118055555555555 | 0 |
| 0.9125 | 0 |
| 0.9131944444444445 | 0 |
| 0.9138888888888889 | 0 |
| 0.9145833333333333 | 0 |
| 0.9152777777777777 | 0 |
| 0.9159722222222223 | 0 |
| 0.9166666666666666 | 0 |
| 0.9173611111111111 | 0 |
| 0.9180555555555556 | 0 |
| 0.9187500000000001 | 0 |
| 0.9194444444444444 | 0 |
| 0.9201388888888888 | 0 |
| 0.9208333333333334 | 0 |
| 0.9215277777777778 | 0 |
| 0.9222222222222222 | 0 |
| 0.9229166666666666 | 0 |
| 0.9236111111111112 | 0 |
| 0.9243055555555556 | 0 |
| 0.9249999999999999 | 0 |
| 0.9256944444444444 | 0 |
| 0.9263888888888889 | 0 |
| 0.9270833333333334 | 0 |
| 0.9277777777777777 | 0 |
| 0.9284722222222223 | 0 |
| 0.9291666666666667 | 0 |
| 0.9298611111111111 | 0 |
| 0.9305555555555555 | 0 |
| 0.93125 | 0 |
| 0.9319444444444445 | 0 |
| 0.9326388888888889 | 0 |
| 0.9333333333333332 | 0 |
| 0.9340277777777778 | 0 |
| 0.9347222222222222 | 0 |
| 0.9354166666666667 | 0 |
| 0.936111111111111 | 0 |
| 0.9368055555555556 | 0 |
| 0.9375 | 0 |
| 0.9381944444444444 | 0 |
| 0.938888888888889 | 0 |
| 0.9395833333333333 | 0 |
| 0.9402777777777778 | 0 |
| 0.9409722222222222 | 0 |
| 0.9416666666666668 | 0 |
| 0.9423611111111111 | 0 |
| 0.9430555555555555 | 0 |
| 0.94375 | 0 |
| 0.9444444444444445 | 0 |
| 0.9451388888888889 | 0 |
| 0.9458333333333333 | 0 |
| 0.9465277777777777 | 0 |
| 0.9472222222222223 | 0 |
| 0.9479166666666666 | 0 |
| 0.9486111111111111 | 0 |
| 0.9493055555555556 | 0 |
| 0.9500000000000001 | 0 |
| 0.9506944444444444 | 0 |
| 0.9513888888888888 | 0 |
| 0.9520833333333334 | 0 |
| 0.9527777777777778 | 0 |
| 0.9534722222222222 | 0 |
| 0.9541666666666666 | 0 |
| 0.9548611111111112 | 0 |
| 0.9555555555555556 | 0 |
| 0.9562499999999999 | 0 |
| 0.9569444444444444 | 0 |
| 0.9576388888888889 | 0 |
| 0.9583333333333334 | 0 |
| 0.9590277777777777 | 0 |
| 0.9597222222222223 | 0 |
| 0.9604166666666667 | 0 |
| 0.9611111111111111 | 0 |
| 0.9618055555555555 | 0 |
| 0.9625 | 0 |
| 0.9631944444444445 | 0 |
| 0.9638888888888889 | 0 |
| 0.9645833333333332 | 0 |
| 0.9652777777777778 | 0 |
| 0.9659722222222222 | 0 |
| 0.9666666666666667 | 0 |
| 0.967361111111111 | 0 |
| 0.9680555555555556 | 0 |
| 0.96875 | 0 |
| 0.9694444444444444 | 0 |
| 0.970138888888889 | 0 |
| 0.9708333333333333 | 0 |
| 0.9715277777777778 | 0 |
| 0.9722222222222222 | 0 |
| 0.9729166666666668 | 0 |
| 0.9736111111111111 | 0 |
| 0.9743055555555555 | 0 |
| 0.975 | 0 |
| 0.9756944444444445 | 0 |
| 0.9763888888888889 | 0 |
| 0.9770833333333333 | 0 |
| 0.9777777777777777 | 0 |
| 0.9784722222222223 | 0 |
| 0.9791666666666666 | 0 |
| 0.9798611111111111 | 0 |
| 0.9805555555555556 | 0 |
| 0.9812500000000001 | 0 |
| 0.9819444444444444 | 0 |
| 0.9826388888888888 | 0 |
| 0.9833333333333334 | 0 |
| 0.9840277777777778 | 0 |
| 0.9847222222222222 | 0 |
| 0.9854166666666666 | 0 |
| 0.9861111111111112 | 0 |
| 0.9868055555555556 | 0 |
| 0.9874999999999999 | 0 |
| 0.9881944444444444 | 0 |
| 0.9888888888888889 | 0 |
| 0.9895833333333334 | 0 |
| 0.9902777777777777 | 0 |
| 0.9909722222222223 | 0 |
| 0.9916666666666667 | 0 |
| 0.9923611111111111 | 0 |
| 0.9930555555555555 | 0 |
| 0.99375 | 0 |
| 0.9944444444444445 | 0 |
| 0.9951388888888889 | 0 |
| 0.9958333333333332 | 0 |
| 0.9965277777777778 | 0 |
| 0.9972222222222222 | 0 |
| 0.9979166666666667 | 0 |
| 0.998611111111111 | 0 |
| 0.9993055555555556 | 0 |